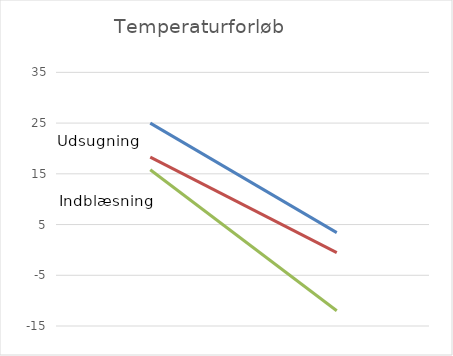
| Category | Series 0 | Series 1 | Series 2 |
|---|---|---|---|
| varm | 25 | 18.298 | 15.812 |
| kold | 3.402 | -0.523 | -12 |